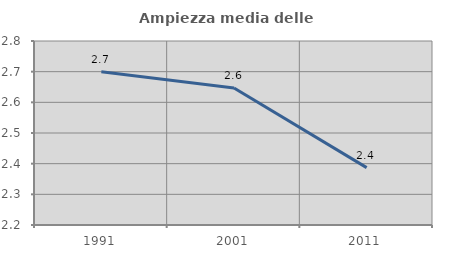
| Category | Ampiezza media delle famiglie |
|---|---|
| 1991.0 | 2.7 |
| 2001.0 | 2.647 |
| 2011.0 | 2.387 |